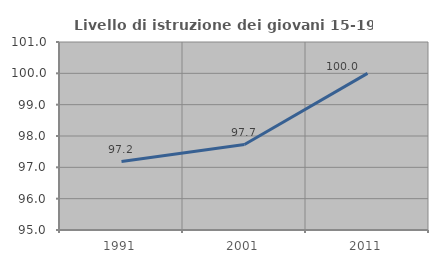
| Category | Livello di istruzione dei giovani 15-19 anni |
|---|---|
| 1991.0 | 97.183 |
| 2001.0 | 97.727 |
| 2011.0 | 100 |